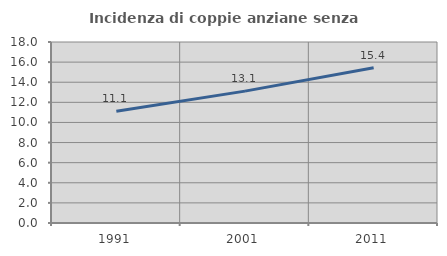
| Category | Incidenza di coppie anziane senza figli  |
|---|---|
| 1991.0 | 11.117 |
| 2001.0 | 13.114 |
| 2011.0 | 15.441 |